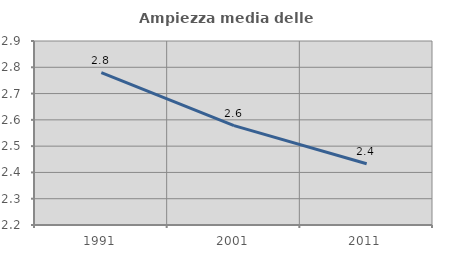
| Category | Ampiezza media delle famiglie |
|---|---|
| 1991.0 | 2.779 |
| 2001.0 | 2.578 |
| 2011.0 | 2.433 |